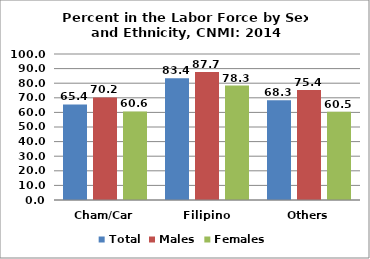
| Category | Total | Males | Females |
|---|---|---|---|
| Cham/Car | 65.423 | 70.244 | 60.646 |
| Filipino | 83.376 | 87.702 | 78.347 |
| Others | 68.306 | 75.367 | 60.451 |